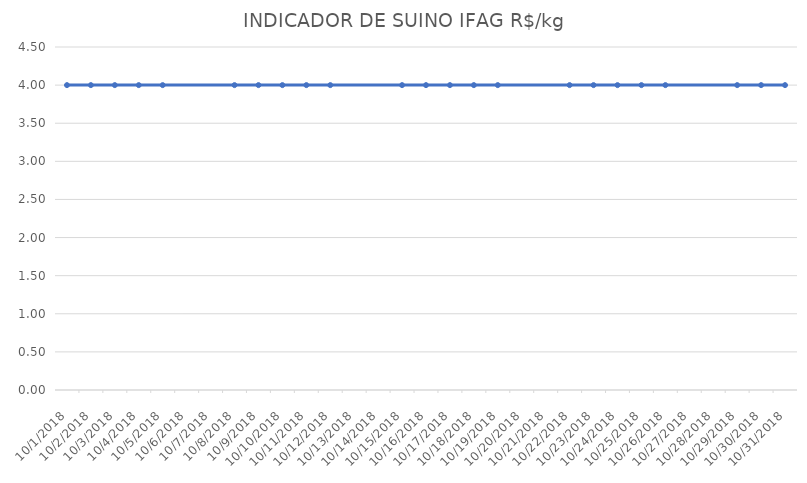
| Category | INDICADOR DE SUINO IFAG |
|---|---|
| 10/1/18 | 4 |
| 10/2/18 | 4 |
| 10/3/18 | 4 |
| 10/4/18 | 4 |
| 10/5/18 | 4 |
| 10/8/18 | 4 |
| 10/9/18 | 4 |
| 10/10/18 | 4 |
| 10/11/18 | 4 |
| 10/12/18 | 4 |
| 10/15/18 | 4 |
| 10/16/18 | 4 |
| 10/17/18 | 4 |
| 10/18/18 | 4 |
| 10/19/18 | 4 |
| 10/22/18 | 4 |
| 10/23/18 | 4 |
| 10/24/18 | 4 |
| 10/25/18 | 4 |
| 10/26/18 | 4 |
| 10/29/18 | 4 |
| 10/30/18 | 4 |
| 10/31/18 | 4 |